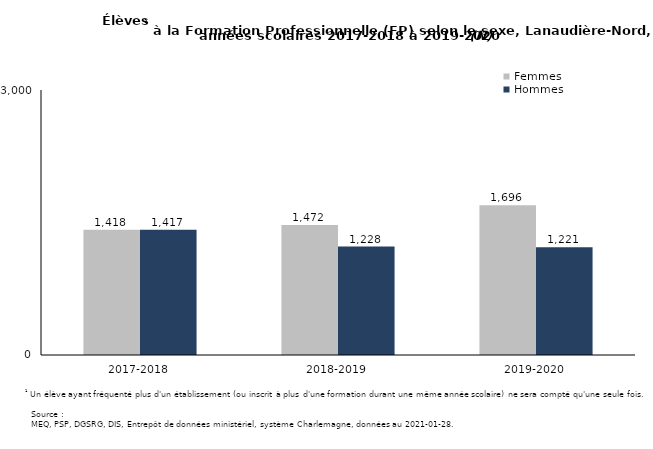
| Category | Femmes | Hommes |
|---|---|---|
| 2017-2018 | 1418 | 1417 |
| 2018-2019 | 1472 | 1228 |
| 2019-2020 | 1696 | 1221 |